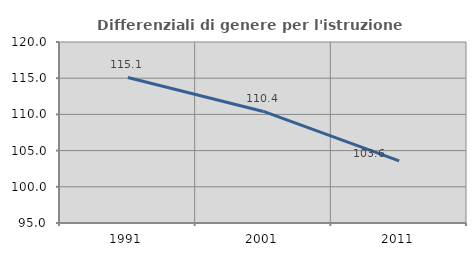
| Category | Differenziali di genere per l'istruzione superiore |
|---|---|
| 1991.0 | 115.103 |
| 2001.0 | 110.406 |
| 2011.0 | 103.59 |